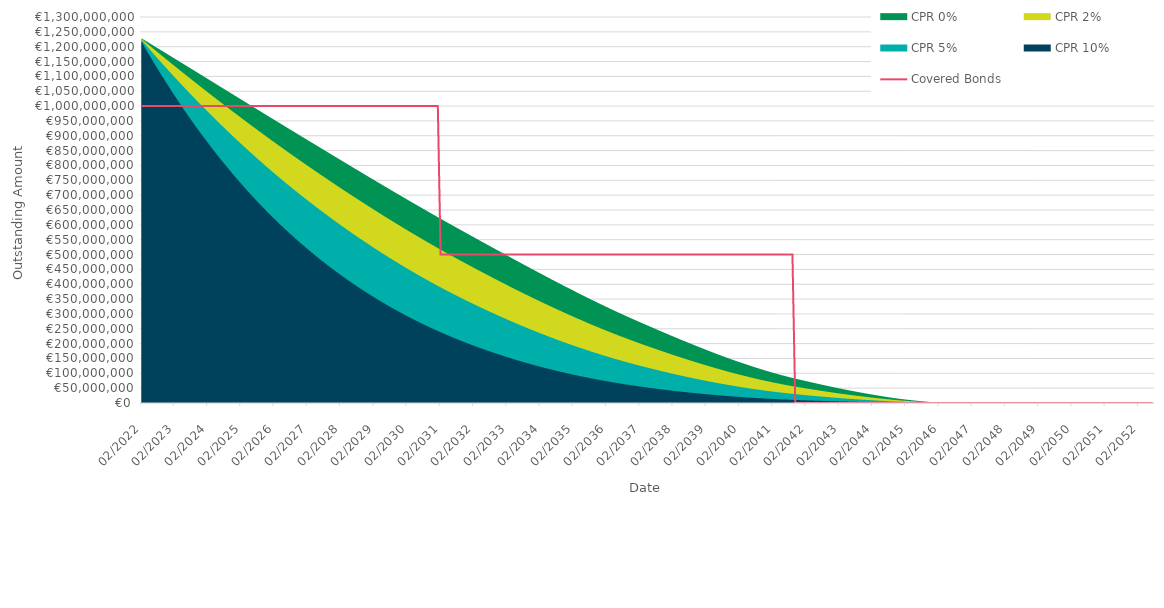
| Category | Covered Bonds |
|---|---|
| 2022-02-28 | 1000000000 |
| 2022-03-31 | 1000000000 |
| 2022-04-30 | 1000000000 |
| 2022-05-31 | 1000000000 |
| 2022-06-30 | 1000000000 |
| 2022-07-31 | 1000000000 |
| 2022-08-31 | 1000000000 |
| 2022-09-30 | 1000000000 |
| 2022-10-31 | 1000000000 |
| 2022-11-30 | 1000000000 |
| 2022-12-31 | 1000000000 |
| 2023-01-31 | 1000000000 |
| 2023-02-28 | 1000000000 |
| 2023-03-31 | 1000000000 |
| 2023-04-30 | 1000000000 |
| 2023-05-31 | 1000000000 |
| 2023-06-30 | 1000000000 |
| 2023-07-31 | 1000000000 |
| 2023-08-31 | 1000000000 |
| 2023-09-30 | 1000000000 |
| 2023-10-31 | 1000000000 |
| 2023-11-30 | 1000000000 |
| 2023-12-31 | 1000000000 |
| 2024-01-31 | 1000000000 |
| 2024-02-29 | 1000000000 |
| 2024-03-31 | 1000000000 |
| 2024-04-30 | 1000000000 |
| 2024-05-31 | 1000000000 |
| 2024-06-30 | 1000000000 |
| 2024-07-31 | 1000000000 |
| 2024-08-31 | 1000000000 |
| 2024-09-30 | 1000000000 |
| 2024-10-31 | 1000000000 |
| 2024-11-30 | 1000000000 |
| 2024-12-31 | 1000000000 |
| 2025-01-31 | 1000000000 |
| 2025-02-28 | 1000000000 |
| 2025-03-31 | 1000000000 |
| 2025-04-30 | 1000000000 |
| 2025-05-31 | 1000000000 |
| 2025-06-30 | 1000000000 |
| 2025-07-31 | 1000000000 |
| 2025-08-31 | 1000000000 |
| 2025-09-30 | 1000000000 |
| 2025-10-31 | 1000000000 |
| 2025-11-30 | 1000000000 |
| 2025-12-31 | 1000000000 |
| 2026-01-31 | 1000000000 |
| 2026-02-28 | 1000000000 |
| 2026-03-31 | 1000000000 |
| 2026-04-30 | 1000000000 |
| 2026-05-31 | 1000000000 |
| 2026-06-30 | 1000000000 |
| 2026-07-31 | 1000000000 |
| 2026-08-31 | 1000000000 |
| 2026-09-30 | 1000000000 |
| 2026-10-31 | 1000000000 |
| 2026-11-30 | 1000000000 |
| 2026-12-31 | 1000000000 |
| 2027-01-31 | 1000000000 |
| 2027-02-28 | 1000000000 |
| 2027-03-31 | 1000000000 |
| 2027-04-30 | 1000000000 |
| 2027-05-31 | 1000000000 |
| 2027-06-30 | 1000000000 |
| 2027-07-31 | 1000000000 |
| 2027-08-31 | 1000000000 |
| 2027-09-30 | 1000000000 |
| 2027-10-31 | 1000000000 |
| 2027-11-30 | 1000000000 |
| 2027-12-31 | 1000000000 |
| 2028-01-31 | 1000000000 |
| 2028-02-29 | 1000000000 |
| 2028-03-31 | 1000000000 |
| 2028-04-30 | 1000000000 |
| 2028-05-31 | 1000000000 |
| 2028-06-30 | 1000000000 |
| 2028-07-31 | 1000000000 |
| 2028-08-31 | 1000000000 |
| 2028-09-30 | 1000000000 |
| 2028-10-31 | 1000000000 |
| 2028-11-30 | 1000000000 |
| 2028-12-31 | 1000000000 |
| 2029-01-31 | 1000000000 |
| 2029-02-28 | 1000000000 |
| 2029-03-31 | 1000000000 |
| 2029-04-30 | 1000000000 |
| 2029-05-31 | 1000000000 |
| 2029-06-30 | 1000000000 |
| 2029-07-31 | 1000000000 |
| 2029-08-31 | 1000000000 |
| 2029-09-30 | 1000000000 |
| 2029-10-31 | 1000000000 |
| 2029-11-30 | 1000000000 |
| 2029-12-31 | 1000000000 |
| 2030-01-31 | 1000000000 |
| 2030-02-28 | 1000000000 |
| 2030-03-31 | 1000000000 |
| 2030-04-30 | 1000000000 |
| 2030-05-31 | 1000000000 |
| 2030-06-30 | 1000000000 |
| 2030-07-31 | 1000000000 |
| 2030-08-31 | 1000000000 |
| 2030-09-30 | 1000000000 |
| 2030-10-31 | 1000000000 |
| 2030-11-30 | 1000000000 |
| 2030-12-31 | 1000000000 |
| 2031-01-31 | 1000000000 |
| 2031-02-28 | 500000000 |
| 2031-03-31 | 500000000 |
| 2031-04-30 | 500000000 |
| 2031-05-31 | 500000000 |
| 2031-06-30 | 500000000 |
| 2031-07-31 | 500000000 |
| 2031-08-31 | 500000000 |
| 2031-09-30 | 500000000 |
| 2031-10-31 | 500000000 |
| 2031-11-30 | 500000000 |
| 2031-12-31 | 500000000 |
| 2032-01-31 | 500000000 |
| 2032-02-29 | 500000000 |
| 2032-03-31 | 500000000 |
| 2032-04-30 | 500000000 |
| 2032-05-31 | 500000000 |
| 2032-06-30 | 500000000 |
| 2032-07-31 | 500000000 |
| 2032-08-31 | 500000000 |
| 2032-09-30 | 500000000 |
| 2032-10-31 | 500000000 |
| 2032-11-30 | 500000000 |
| 2032-12-31 | 500000000 |
| 2033-01-31 | 500000000 |
| 2033-02-28 | 500000000 |
| 2033-03-31 | 500000000 |
| 2033-04-30 | 500000000 |
| 2033-05-31 | 500000000 |
| 2033-06-30 | 500000000 |
| 2033-07-31 | 500000000 |
| 2033-08-31 | 500000000 |
| 2033-09-30 | 500000000 |
| 2033-10-31 | 500000000 |
| 2033-11-30 | 500000000 |
| 2033-12-31 | 500000000 |
| 2034-01-31 | 500000000 |
| 2034-02-28 | 500000000 |
| 2034-03-31 | 500000000 |
| 2034-04-30 | 500000000 |
| 2034-05-31 | 500000000 |
| 2034-06-30 | 500000000 |
| 2034-07-31 | 500000000 |
| 2034-08-31 | 500000000 |
| 2034-09-30 | 500000000 |
| 2034-10-31 | 500000000 |
| 2034-11-30 | 500000000 |
| 2034-12-31 | 500000000 |
| 2035-01-31 | 500000000 |
| 2035-02-28 | 500000000 |
| 2035-03-31 | 500000000 |
| 2035-04-30 | 500000000 |
| 2035-05-31 | 500000000 |
| 2035-06-30 | 500000000 |
| 2035-07-31 | 500000000 |
| 2035-08-31 | 500000000 |
| 2035-09-30 | 500000000 |
| 2035-10-31 | 500000000 |
| 2035-11-30 | 500000000 |
| 2035-12-31 | 500000000 |
| 2036-01-31 | 500000000 |
| 2036-02-29 | 500000000 |
| 2036-03-31 | 500000000 |
| 2036-04-30 | 500000000 |
| 2036-05-31 | 500000000 |
| 2036-06-30 | 500000000 |
| 2036-07-31 | 500000000 |
| 2036-08-31 | 500000000 |
| 2036-09-30 | 500000000 |
| 2036-10-31 | 500000000 |
| 2036-11-30 | 500000000 |
| 2036-12-31 | 500000000 |
| 2037-01-31 | 500000000 |
| 2037-02-28 | 500000000 |
| 2037-03-31 | 500000000 |
| 2037-04-30 | 500000000 |
| 2037-05-31 | 500000000 |
| 2037-06-30 | 500000000 |
| 2037-07-31 | 500000000 |
| 2037-08-31 | 500000000 |
| 2037-09-30 | 500000000 |
| 2037-10-31 | 500000000 |
| 2037-11-30 | 500000000 |
| 2037-12-31 | 500000000 |
| 2038-01-31 | 500000000 |
| 2038-02-28 | 500000000 |
| 2038-03-31 | 500000000 |
| 2038-04-30 | 500000000 |
| 2038-05-31 | 500000000 |
| 2038-06-30 | 500000000 |
| 2038-07-31 | 500000000 |
| 2038-08-31 | 500000000 |
| 2038-09-30 | 500000000 |
| 2038-10-31 | 500000000 |
| 2038-11-30 | 500000000 |
| 2038-12-31 | 500000000 |
| 2039-01-31 | 500000000 |
| 2039-02-28 | 500000000 |
| 2039-03-31 | 500000000 |
| 2039-04-30 | 500000000 |
| 2039-05-31 | 500000000 |
| 2039-06-30 | 500000000 |
| 2039-07-31 | 500000000 |
| 2039-08-31 | 500000000 |
| 2039-09-30 | 500000000 |
| 2039-10-31 | 500000000 |
| 2039-11-30 | 500000000 |
| 2039-12-31 | 500000000 |
| 2040-01-31 | 500000000 |
| 2040-02-29 | 500000000 |
| 2040-03-31 | 500000000 |
| 2040-04-30 | 500000000 |
| 2040-05-31 | 500000000 |
| 2040-06-30 | 500000000 |
| 2040-07-31 | 500000000 |
| 2040-08-31 | 500000000 |
| 2040-09-30 | 500000000 |
| 2040-10-31 | 500000000 |
| 2040-11-30 | 500000000 |
| 2040-12-31 | 500000000 |
| 2041-01-31 | 500000000 |
| 2041-02-28 | 500000000 |
| 2041-03-31 | 500000000 |
| 2041-04-30 | 500000000 |
| 2041-05-31 | 500000000 |
| 2041-06-30 | 500000000 |
| 2041-07-31 | 500000000 |
| 2041-08-31 | 500000000 |
| 2041-09-30 | 500000000 |
| 2041-10-31 | 0 |
| 2041-11-30 | 0 |
| 2041-12-31 | 0 |
| 2042-01-31 | 0 |
| 2042-02-28 | 0 |
| 2042-03-31 | 0 |
| 2042-04-30 | 0 |
| 2042-05-31 | 0 |
| 2042-06-30 | 0 |
| 2042-07-31 | 0 |
| 2042-08-31 | 0 |
| 2042-09-30 | 0 |
| 2042-10-31 | 0 |
| 2042-11-30 | 0 |
| 2042-12-31 | 0 |
| 2043-01-31 | 0 |
| 2043-02-28 | 0 |
| 2043-03-31 | 0 |
| 2043-04-30 | 0 |
| 2043-05-31 | 0 |
| 2043-06-30 | 0 |
| 2043-07-31 | 0 |
| 2043-08-31 | 0 |
| 2043-09-30 | 0 |
| 2043-10-31 | 0 |
| 2043-11-30 | 0 |
| 2043-12-31 | 0 |
| 2044-01-31 | 0 |
| 2044-02-29 | 0 |
| 2044-03-31 | 0 |
| 2044-04-30 | 0 |
| 2044-05-31 | 0 |
| 2044-06-30 | 0 |
| 2044-07-31 | 0 |
| 2044-08-31 | 0 |
| 2044-09-30 | 0 |
| 2044-10-31 | 0 |
| 2044-11-30 | 0 |
| 2044-12-31 | 0 |
| 2045-01-31 | 0 |
| 2045-02-28 | 0 |
| 2045-03-31 | 0 |
| 2045-04-30 | 0 |
| 2045-05-31 | 0 |
| 2045-06-30 | 0 |
| 2045-07-31 | 0 |
| 2045-08-31 | 0 |
| 2045-09-30 | 0 |
| 2045-10-31 | 0 |
| 2045-11-30 | 0 |
| 2045-12-31 | 0 |
| 2046-01-31 | 0 |
| 2046-02-28 | 0 |
| 2046-03-31 | 0 |
| 2046-04-30 | 0 |
| 2046-05-31 | 0 |
| 2046-06-30 | 0 |
| 2046-07-31 | 0 |
| 2046-08-31 | 0 |
| 2046-09-30 | 0 |
| 2046-10-31 | 0 |
| 2046-11-30 | 0 |
| 2046-12-31 | 0 |
| 2047-01-31 | 0 |
| 2047-02-28 | 0 |
| 2047-03-31 | 0 |
| 2047-04-30 | 0 |
| 2047-05-31 | 0 |
| 2047-06-30 | 0 |
| 2047-07-31 | 0 |
| 2047-08-31 | 0 |
| 2047-09-30 | 0 |
| 2047-10-31 | 0 |
| 2047-11-30 | 0 |
| 2047-12-31 | 0 |
| 2048-01-31 | 0 |
| 2048-02-29 | 0 |
| 2048-03-31 | 0 |
| 2048-04-30 | 0 |
| 2048-05-31 | 0 |
| 2048-06-30 | 0 |
| 2048-07-31 | 0 |
| 2048-08-31 | 0 |
| 2048-09-30 | 0 |
| 2048-10-31 | 0 |
| 2048-11-30 | 0 |
| 2048-12-31 | 0 |
| 2049-01-31 | 0 |
| 2049-02-28 | 0 |
| 2049-03-31 | 0 |
| 2049-04-30 | 0 |
| 2049-05-31 | 0 |
| 2049-06-30 | 0 |
| 2049-07-31 | 0 |
| 2049-08-31 | 0 |
| 2049-09-30 | 0 |
| 2049-10-31 | 0 |
| 2049-11-30 | 0 |
| 2049-12-31 | 0 |
| 2050-01-31 | 0 |
| 2050-02-28 | 0 |
| 2050-03-31 | 0 |
| 2050-04-30 | 0 |
| 2050-05-31 | 0 |
| 2050-06-30 | 0 |
| 2050-07-31 | 0 |
| 2050-08-31 | 0 |
| 2050-09-30 | 0 |
| 2050-10-31 | 0 |
| 2050-11-30 | 0 |
| 2050-12-31 | 0 |
| 2051-01-31 | 0 |
| 2051-02-28 | 0 |
| 2051-03-31 | 0 |
| 2051-04-30 | 0 |
| 2051-05-31 | 0 |
| 2051-06-30 | 0 |
| 2051-07-31 | 0 |
| 2051-08-31 | 0 |
| 2051-09-30 | 0 |
| 2051-10-31 | 0 |
| 2051-11-30 | 0 |
| 2051-12-31 | 0 |
| 2052-01-31 | 0 |
| 2052-02-29 | 0 |
| 2052-03-31 | 0 |
| 2052-04-30 | 0 |
| 2052-05-31 | 0 |
| 2052-06-30 | 0 |
| 2052-07-31 | 0 |